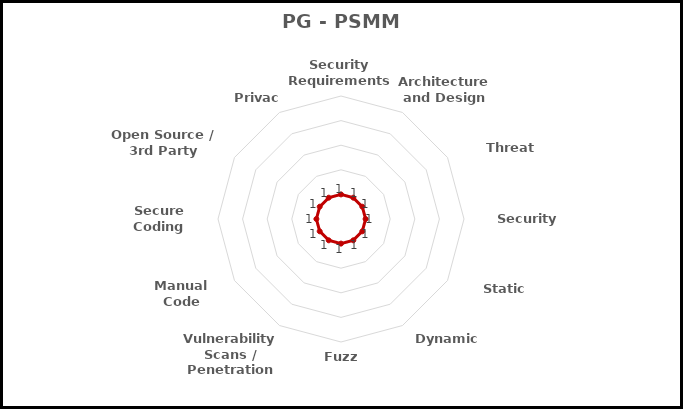
| Category | Technical Parameters |
|---|---|
| Security Requirements Plan | 1 |
| Architecture and Design Reviews | 1 |
| Threat Modeling | 1 |
| Security Testing | 1 |
| Static Analysis | 1 |
| Dynamic Analysis | 1 |
| Fuzz Testing | 1 |
| Vulnerability Scans / Penetration Testing | 1 |
| Manual Code Reviews | 1 |
| Secure Coding Standards | 1 |
| Open Source / 3rd Party Libraries | 1 |
| Privacy | 1 |